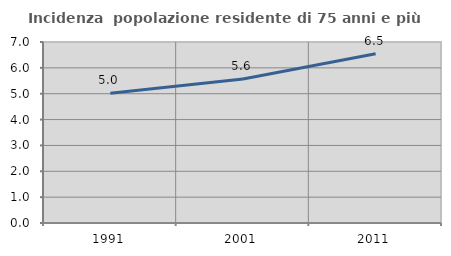
| Category | Incidenza  popolazione residente di 75 anni e più |
|---|---|
| 1991.0 | 5.021 |
| 2001.0 | 5.567 |
| 2011.0 | 6.547 |